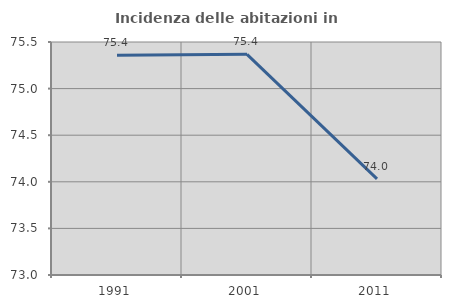
| Category | Incidenza delle abitazioni in proprietà  |
|---|---|
| 1991.0 | 75.358 |
| 2001.0 | 75.368 |
| 2011.0 | 74.032 |